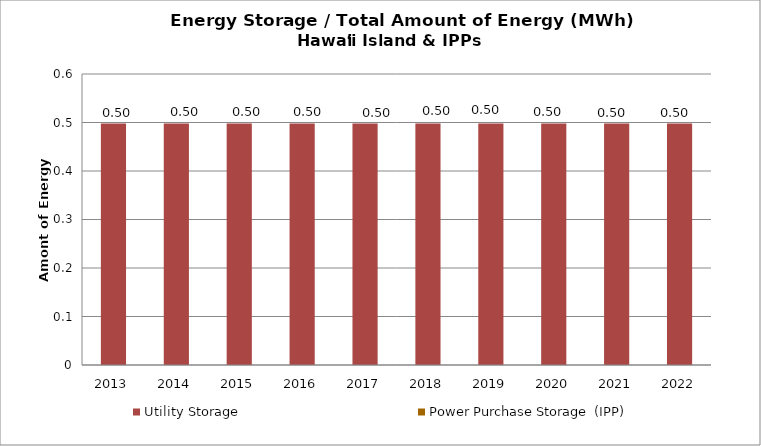
| Category | Utility Storage | Power Purchase Storage  (IPP) |
|---|---|---|
| 2013.0 | 0.498 | 0 |
| 2014.0 | 0.498 | 0 |
| 2015.0 | 0.498 | 0 |
| 2016.0 | 0.498 | 0 |
| 2017.0 | 0.498 | 0 |
| 2018.0 | 0.498 | 0 |
| 2019.0 | 0.498 | 0 |
| 2020.0 | 0.498 | 0 |
| 2021.0 | 0.498 | 0 |
| 2022.0 | 0.498 | 0 |